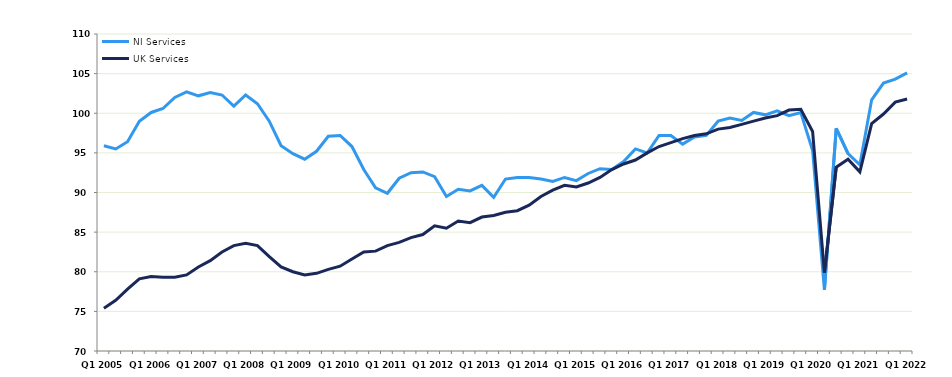
| Category | NI Services | UK Services |
|---|---|---|
| Q1 2005 | 95.9 | 75.4 |
|  | 95.5 | 76.4 |
|  | 96.4 | 77.8 |
|  | 99 | 79.1 |
| Q1 2006 | 100.1 | 79.4 |
|  | 100.6 | 79.3 |
|  | 102 | 79.3 |
|  | 102.7 | 79.6 |
| Q1 2007 | 102.2 | 80.6 |
|  | 102.6 | 81.4 |
|  | 102.3 | 82.5 |
|  | 100.9 | 83.3 |
| Q1 2008 | 102.3 | 83.6 |
|  | 101.2 | 83.3 |
|  | 99 | 81.9 |
|  | 95.9 | 80.6 |
| Q1 2009 | 94.9 | 80 |
|  | 94.2 | 79.6 |
|  | 95.2 | 79.8 |
|  | 97.1 | 80.3 |
| Q1 2010 | 97.2 | 80.7 |
|  | 95.8 | 81.6 |
|  | 92.9 | 82.5 |
|  | 90.6 | 82.6 |
| Q1 2011 | 89.9 | 83.3 |
|  | 91.8 | 83.7 |
|  | 92.5 | 84.3 |
|  | 92.6 | 84.7 |
| Q1 2012 | 92 | 85.8 |
|  | 89.5 | 85.5 |
|  | 90.4 | 86.4 |
|  | 90.2 | 86.2 |
| Q1 2013 | 90.9 | 86.9 |
|  | 89.4 | 87.1 |
|  | 91.7 | 87.5 |
|  | 91.9 | 87.7 |
| Q1 2014 | 91.9 | 88.4 |
|  | 91.7 | 89.5 |
|  | 91.4 | 90.3 |
|  | 91.9 | 90.9 |
| Q1 2015 | 91.5 | 90.7 |
|  | 92.4 | 91.2 |
|  | 93 | 91.9 |
|  | 92.9 | 92.9 |
| Q1 2016 | 93.9 | 93.6 |
|  | 95.5 | 94.1 |
|  | 95 | 95 |
|  | 97.2 | 95.8 |
| Q1 2017 | 97.2 | 96.3 |
|  | 96.1 | 96.8 |
|  | 97 | 97.2 |
|  | 97.2 | 97.4 |
| Q1 2018 | 99 | 98 |
|  | 99.4 | 98.2 |
|  | 99.1 | 98.6 |
|  | 100.1 | 99 |
| Q1 2019 | 99.8 | 99.4 |
|  | 100.3 | 99.7 |
|  | 99.7 | 100.4 |
|  | 100.1 | 100.5 |
| Q1 2020 | 95.3 | 97.7 |
|  | 77.7 | 79.9 |
|  | 98.1 | 93.2 |
|  | 94.9 | 94.2 |
| Q1 2021 | 93.5 | 92.6 |
|  | 101.7 | 98.7 |
|  | 103.8 | 99.9 |
|  | 104.3 | 101.4 |
| Q1 2022 | 105.1 | 101.8 |